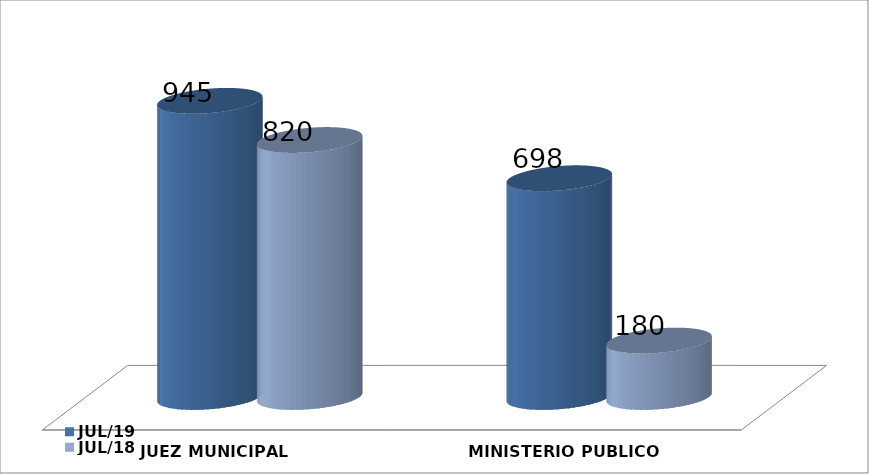
| Category | JUL/19 | JUL/18 |
|---|---|---|
| JUEZ MUNICIPAL | 945 | 820 |
| MINISTERIO PUBLICO | 698 | 180 |